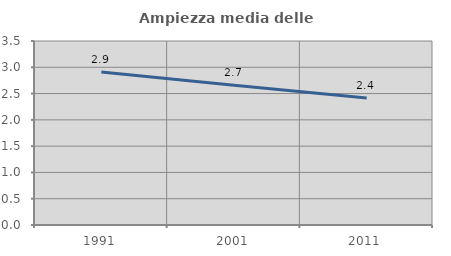
| Category | Ampiezza media delle famiglie |
|---|---|
| 1991.0 | 2.909 |
| 2001.0 | 2.66 |
| 2011.0 | 2.414 |